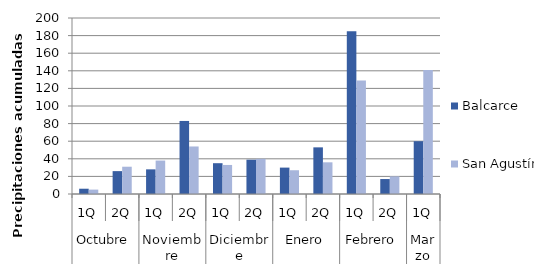
| Category | Balcarce | San Agustín |
|---|---|---|
| 0 | 6 | 5 |
| 1 | 26 | 31 |
| 2 | 28 | 38 |
| 3 | 83 | 54 |
| 4 | 35 | 33 |
| 5 | 39 | 40 |
| 6 | 30 | 27 |
| 7 | 53 | 36 |
| 8 | 185 | 129 |
| 9 | 17 | 20 |
| 10 | 60 | 141 |